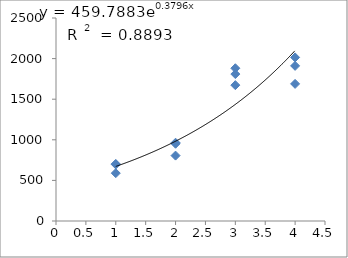
| Category | Series 0 |
|---|---|
| 1.0 | 702.92 |
| 1.0 | 589.021 |
| 1.0 | 696.411 |
| 2.0 | 964.008 |
| 2.0 | 951.324 |
| 2.0 | 805.454 |
| 3.0 | 1673.058 |
| 3.0 | 1881.292 |
| 3.0 | 1809.487 |
| 4.0 | 1688.73 |
| 4.0 | 2014.739 |
| 4.0 | 1910.416 |